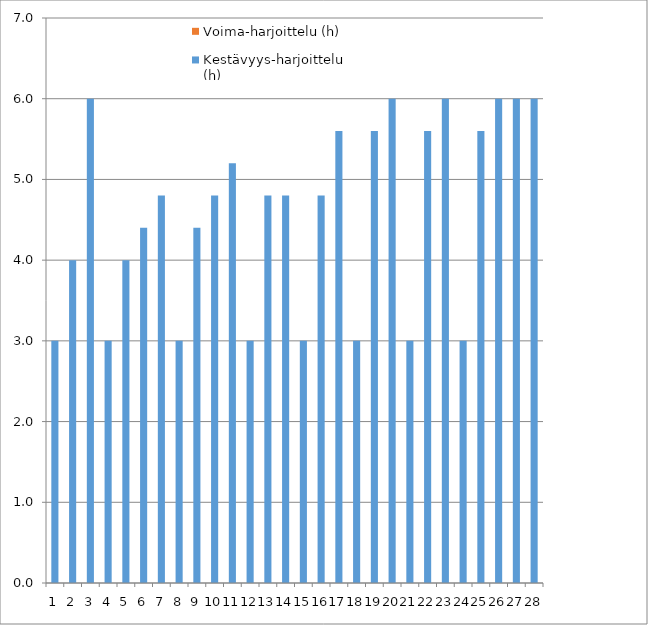
| Category | Kestävyys-harjoittelu (h) | Voima-harjoittelu (h) |
|---|---|---|
| 0 | 3 | 0 |
| 1 | 4 | 0 |
| 2 | 6 | 0 |
| 3 | 3 | 0 |
| 4 | 4 | 0 |
| 5 | 4.4 | 0 |
| 6 | 4.8 | 0 |
| 7 | 3 | 0 |
| 8 | 4.4 | 0 |
| 9 | 4.8 | 0 |
| 10 | 5.2 | 0 |
| 11 | 3 | 0 |
| 12 | 4.8 | 0 |
| 13 | 4.8 | 0 |
| 14 | 3 | 0 |
| 15 | 4.8 | 0 |
| 16 | 5.6 | 0 |
| 17 | 3 | 0 |
| 18 | 5.6 | 0 |
| 19 | 6 | 0 |
| 20 | 3 | 0 |
| 21 | 5.6 | 0 |
| 22 | 6 | 0 |
| 23 | 3 | 0 |
| 24 | 5.6 | 0 |
| 25 | 6 | 0 |
| 26 | 6 | 0 |
| 27 | 6 | 0 |